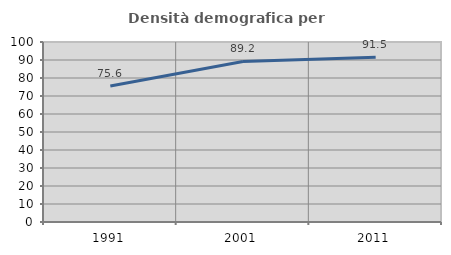
| Category | Densità demografica |
|---|---|
| 1991.0 | 75.575 |
| 2001.0 | 89.168 |
| 2011.0 | 91.492 |